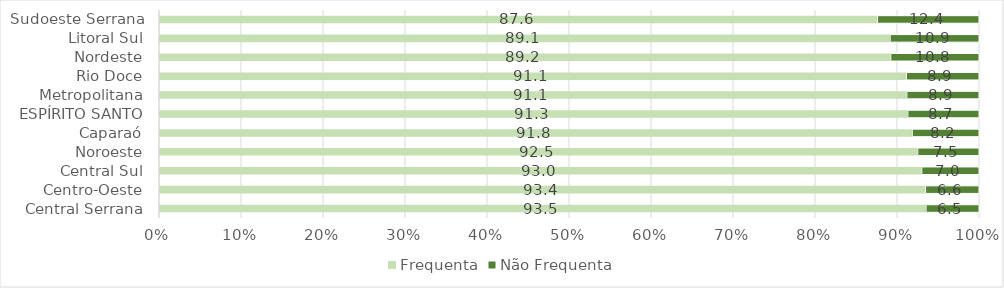
| Category | Frequenta | Não Frequenta |
|---|---|---|
| Central Serrana | 93.484 | 6.516 |
| Centro-Oeste | 93.421 | 6.579 |
| Central Sul | 92.965 | 7.035 |
| Noroeste | 92.473 | 7.527 |
| Caparaó | 91.803 | 8.197 |
| ESPÍRITO SANTO | 91.266 | 8.734 |
| Metropolitana | 91.144 | 8.856 |
| Rio Doce | 91.095 | 8.905 |
| Nordeste | 89.183 | 10.817 |
| Litoral Sul | 89.106 | 10.894 |
| Sudoeste Serrana | 87.565 | 12.435 |